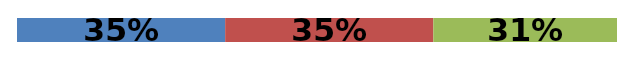
| Category | Series 0 | Series 1 | Series 2 |
|---|---|---|---|
| 0 | 0.347 | 0.347 | 0.306 |